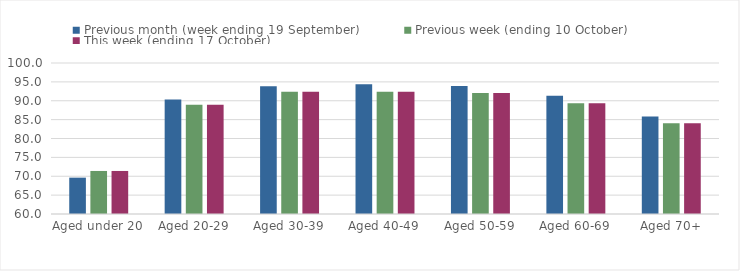
| Category | Previous month (week ending 19 September) | Previous week (ending 10 October) | This week (ending 17 October) |
|---|---|---|---|
| Aged under 20 | 69.63 | 71.4 | 71.4 |
| Aged 20-29 | 90.36 | 88.97 | 88.97 |
| Aged 30-39 | 93.86 | 92.4 | 92.4 |
| Aged 40-49 | 94.39 | 92.39 | 92.39 |
| Aged 50-59 | 93.93 | 92.05 | 92.05 |
| Aged 60-69 | 91.35 | 89.37 | 89.37 |
| Aged 70+ | 85.83 | 84.01 | 84.01 |